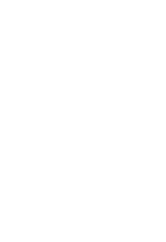
| Category | Series 0 |
|---|---|
| Subject knowledge | 0 |
| Research methods - theoretical knowledge | 0 |
| Research methods - practical application | 0 |
| Information seeking | 0 |
| Information literacy and management | 0 |
| Languages | 0 |
| Academic literacy and numeracy | 0 |